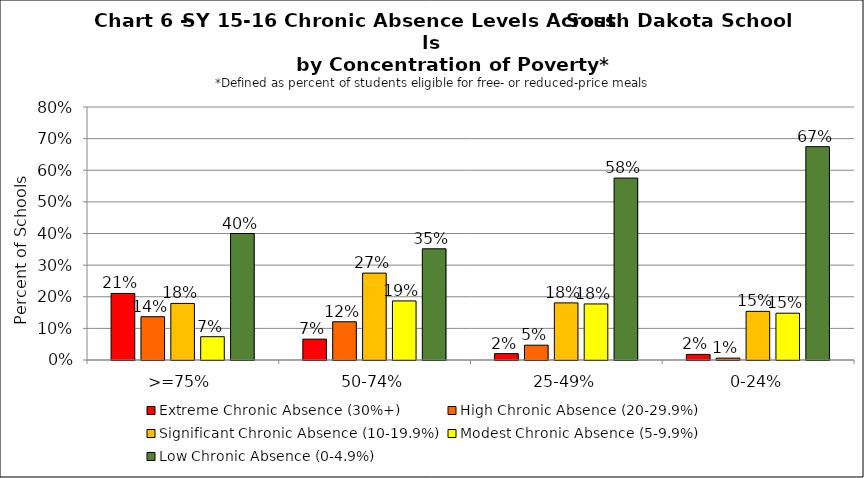
| Category | Extreme Chronic Absence (30%+) | High Chronic Absence (20-29.9%) | Significant Chronic Absence (10-19.9%) | Modest Chronic Absence (5-9.9%) | Low Chronic Absence (0-4.9%) |
|---|---|---|---|---|---|
| 0 | 0.211 | 0.137 | 0.179 | 0.074 | 0.4 |
| 1 | 0.066 | 0.121 | 0.275 | 0.187 | 0.352 |
| 2 | 0.02 | 0.047 | 0.181 | 0.177 | 0.575 |
| 3 | 0.018 | 0.006 | 0.154 | 0.148 | 0.675 |